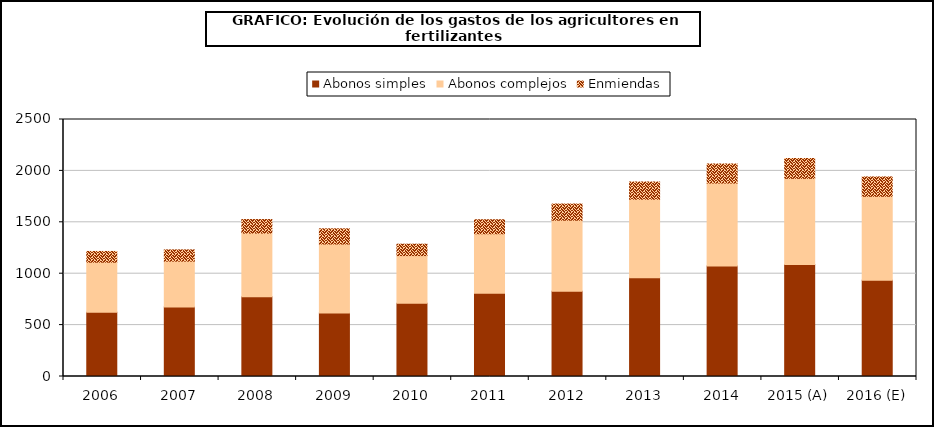
| Category | Abonos simples | Abonos complejos | Enmiendas |
|---|---|---|---|
| 2006 | 623.947 | 487.841 | 104.7 |
| 2007 | 675.341 | 446.76 | 109.46 |
| 2008 | 776.533 | 618.526 | 131.725 |
| 2009 | 617.926 | 671.033 | 147.519 |
| 2010 | 711.864 | 464.475 | 110.568 |
| 2011 | 809.32 | 580.242 | 135.989 |
| 2012 | 828.171 | 692.087 | 157.487 |
| 2013 | 959.679 | 764.88 | 167.637 |
| 2014 | 1074.953 | 806.665 | 185.766 |
| 2015 (A) | 1088.422 | 839.005 | 193.214 |
| 2016 (E) | 935.205 | 817.848 | 188.342 |